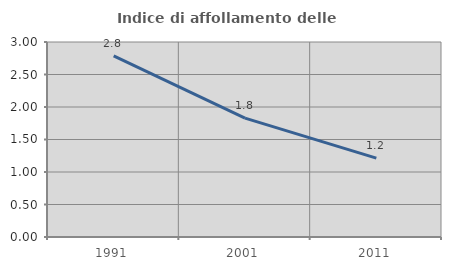
| Category | Indice di affollamento delle abitazioni  |
|---|---|
| 1991.0 | 2.785 |
| 2001.0 | 1.828 |
| 2011.0 | 1.213 |